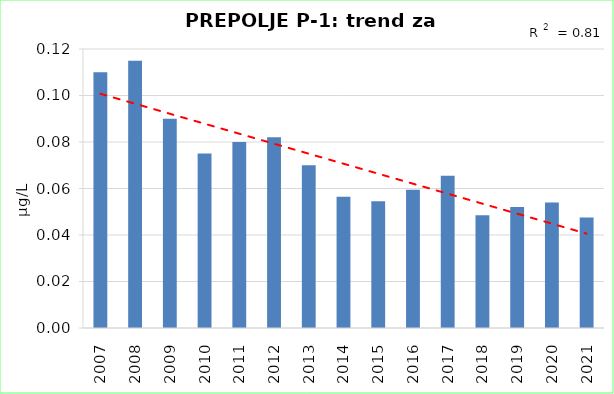
| Category | Vsota |
|---|---|
| 2007 | 0.11 |
| 2008 | 0.115 |
| 2009 | 0.09 |
| 2010 | 0.075 |
| 2011 | 0.08 |
| 2012 | 0.082 |
| 2013 | 0.07 |
| 2014 | 0.056 |
| 2015 | 0.054 |
| 2016 | 0.06 |
| 2017 | 0.066 |
| 2018 | 0.048 |
| 2019 | 0.052 |
| 2020 | 0.054 |
| 2021 | 0.048 |